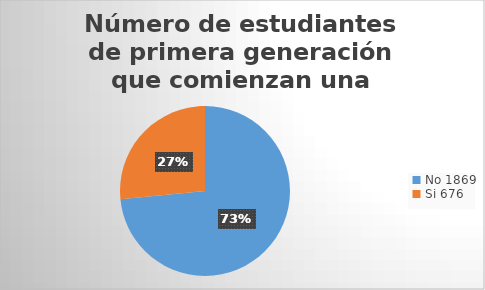
| Category | Número de estudiantes de primera generación que comienzan una carrera |
|---|---|
| 0 | 1869 |
| 1 | 676 |